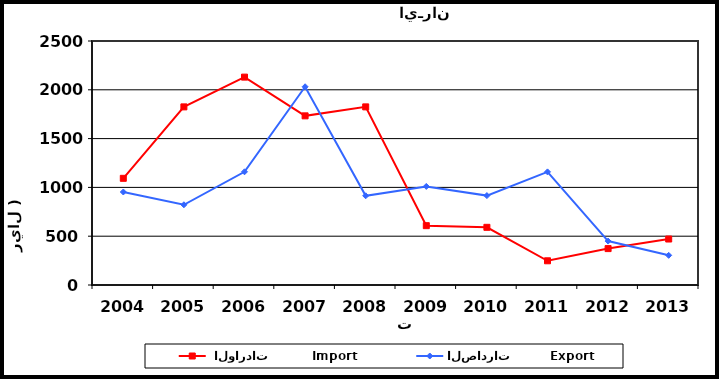
| Category |  الواردات           Import | الصادرات          Export |
|---|---|---|
| 2004.0 | 1093 | 953 |
| 2005.0 | 1825 | 822 |
| 2006.0 | 2130 | 1160 |
| 2007.0 | 1733 | 2031 |
| 2008.0 | 1825 | 914 |
| 2009.0 | 608 | 1010 |
| 2010.0 | 591 | 916 |
| 2011.0 | 248 | 1159 |
| 2012.0 | 373 | 450 |
| 2013.0 | 471 | 304 |